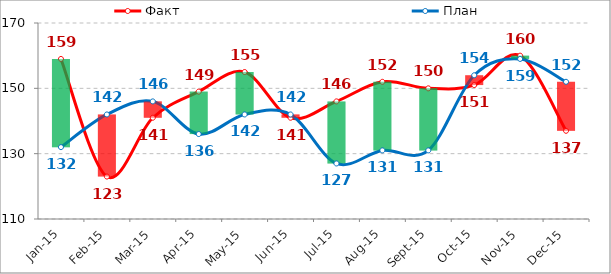
| Category | Факт | План |
|---|---|---|
| 2015-01-01 | 159 | 132 |
| 2015-02-01 | 123 | 142 |
| 2015-03-01 | 141 | 146 |
| 2015-04-01 | 149 | 136 |
| 2015-05-01 | 155 | 142 |
| 2015-06-01 | 141 | 142 |
| 2015-07-01 | 146 | 127 |
| 2015-08-01 | 152 | 131 |
| 2015-09-01 | 150 | 131 |
| 2015-10-01 | 151 | 154 |
| 2015-11-01 | 160 | 159 |
| 2015-12-01 | 137 | 152 |